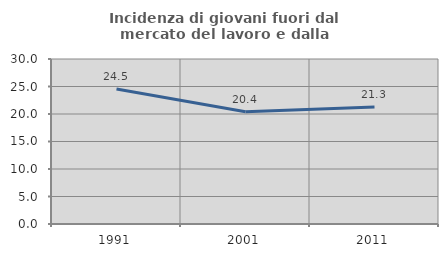
| Category | Incidenza di giovani fuori dal mercato del lavoro e dalla formazione  |
|---|---|
| 1991.0 | 24.532 |
| 2001.0 | 20.427 |
| 2011.0 | 21.262 |